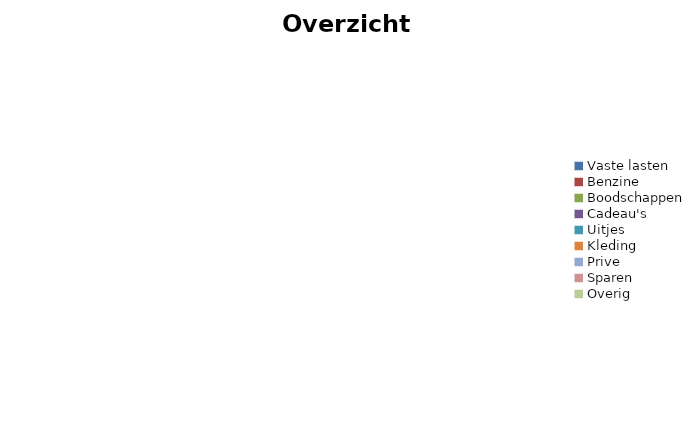
| Category | Overzicht uitgaven |
|---|---|
| Vaste lasten | 0 |
| Benzine | 0 |
| Boodschappen | 0 |
| Cadeau's | 0 |
| Uitjes | 0 |
| Kleding | 0 |
| Prive | 0 |
| Sparen | 0 |
| Overig | 0 |